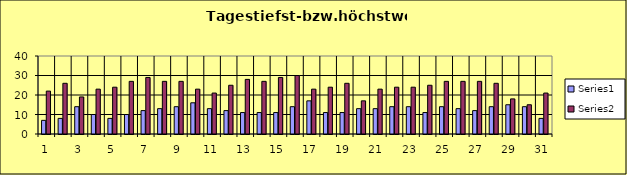
| Category | Series 0 | Series 1 |
|---|---|---|
| 0 | 7 | 22 |
| 1 | 8 | 26 |
| 2 | 14 | 19 |
| 3 | 10 | 23 |
| 4 | 8 | 24 |
| 5 | 10 | 27 |
| 6 | 12 | 29 |
| 7 | 13 | 27 |
| 8 | 14 | 27 |
| 9 | 16 | 23 |
| 10 | 13 | 21 |
| 11 | 12 | 25 |
| 12 | 11 | 28 |
| 13 | 11 | 27 |
| 14 | 11 | 29 |
| 15 | 14 | 30 |
| 16 | 17 | 23 |
| 17 | 11 | 24 |
| 18 | 11 | 26 |
| 19 | 13 | 17 |
| 20 | 13 | 23 |
| 21 | 14 | 24 |
| 22 | 14 | 24 |
| 23 | 11 | 25 |
| 24 | 14 | 27 |
| 25 | 13 | 27 |
| 26 | 12 | 27 |
| 27 | 14 | 26 |
| 28 | 15 | 18 |
| 29 | 14 | 15 |
| 30 | 8 | 21 |